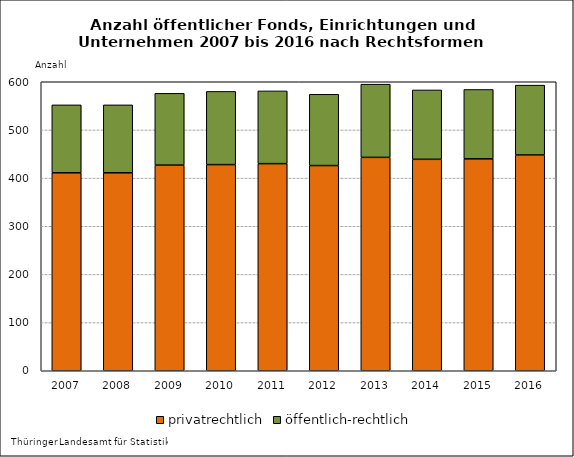
| Category | privatrechtlich | öffentlich-rechtlich |
|---|---|---|
| 2007.0 | 411 | 141 |
| 2008.0 | 411 | 141 |
| 2009.0 | 427 | 149 |
| 2010.0 | 428 | 152 |
| 2011.0 | 430 | 151 |
| 2012.0 | 426 | 148 |
| 2013.0 | 443 | 152 |
| 2014.0 | 439 | 144 |
| 2015.0 | 440 | 144 |
| 2016.0 | 448 | 145 |